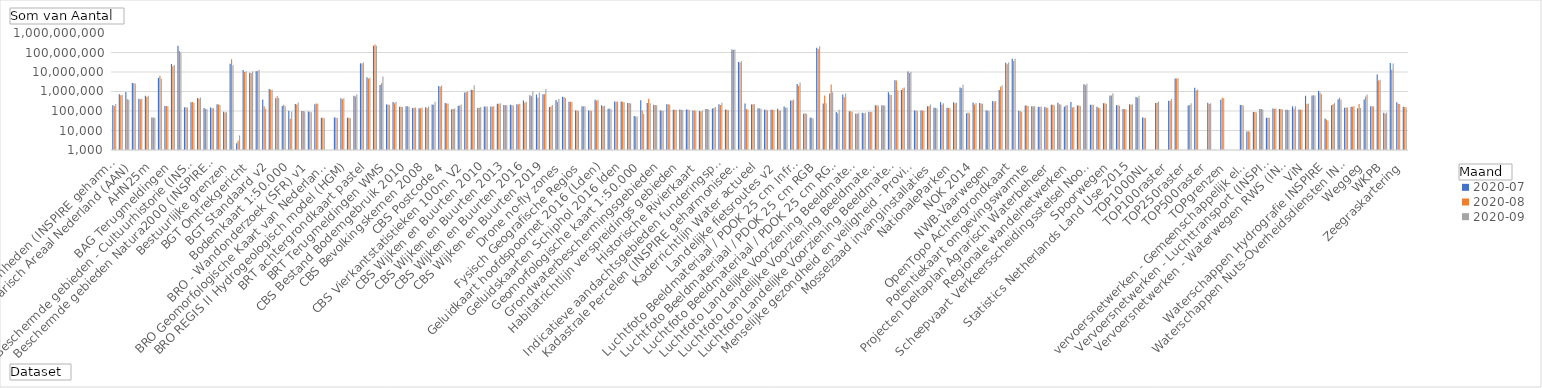
| Category | 2020-07 | 2020-08 | 2020-09 |
|---|---|---|---|
| Administratieve Eenheden (INSPIRE geharmoniseerd) | 198083 | 181839 | 227996 |
| Adressen (INSPIRE as-is) | 727634 | 640294 | 660280 |
| Adressen (INSPIRE geharmoniseerd) | 952412 | 399175 | 373213 |
| Agrarisch Areaal Nederland (AAN) | 2694952 | 2650679 | 2541201 |
| AHN1 | 427110 | 405824 | 427097 |
| AHN2 | 608271 | 515250 | 600037 |
| AHN25m | 46281 | 46161 | 44662 |
| AHN3 | 4969335 | 6356489 | 4466156 |
| Asbest scholenkaart | 182041 | 179001 | 176460 |
| BAG Terugmeldingen | 25712626 | 19608143 | 22717865 |
| BAGv1.1 | 220099471 | 119269418 | 99278156 |
| Beschermde gebieden - CDDA (INSPIRE geharmoniseerd) | 154346 | 153505 | 153034 |
| Beschermde gebieden - Cultuurhistorie (INSPIRE geharmoniseerd) | 285003 | 293150 | 258478 |
| Beschermde gebieden - Provincies (INSPIRE geharmoniseerd) | 460841 | 430606 | 494414 |
| Beschermde gebieden Nationale Parken (INSPIRE Geharmoniseerd) | 142062 | 125950 | 124117 |
| Beschermde gebieden Natura2000 (INSPIRE Geharmoniseerd) | 151690 | 139290 | 140931 |
| Beschermde gebieden Wetlands (INSPIRE Geharmoniseerd) | 220169 | 214620 | 202304 |
| Beschermde natuurmonumenten | 91910 | 82686 | 87700 |
| Bestuurlijke grenzen | 26513258 | 45641611 | 22099939 |
| BGT (extract) | 2235 | 2944 | 5630 |
| BGT Achtergrond | 12486517 | 10079108 | 10850455 |
| BGT Omtrekgericht | 9097327 | 8711046 | 10454254 |
| BGT Pastel | 11060649 | 11142897 | 13184371 |
| BGT Plantopografie | 393129 | 174023 | 128789 |
| BGT Standaard v2 | 1341460 | 1222701 | 1228446 |
| BGT Symbolen v2 | 449772 | 568701 | 460321 |
| BGT Terugmeldingen | 182857 | 206742 | 173373 |
| Bodemkaart 1:50.000 | 101634 | 39844 | 95455 |
| BRO - Bodemkaart (SGM) | 230235 | 213284 | 272368 |
| BRO - Geotechnische Boormonsteranalyse (BHR-GT) v1 | 101219 | 100750 | 95522 |
| BRO - Wandonderzoek (SFR) v1 | 93912 | 91553 | 87063 |
| BRO Bodemkundige boormonsterbeschrijvingen (BHR-P) | 223144 | 241202 | 233184 |
| BRO Digitaal Geologisch Model (DGM) | 45418 | 45023 | 42124 |
| BRO Geomorfologische Kaart van Nederland 2019 V1 | 504 | 310 | 289 |
| BRO GeoTop Model Download (GTM) | 46229 | 45909 | 43354 |
| BRO Grondwatermonitoringput (GMW) | 450266 | 405292 | 454898 |
| BRO REGIS II Hydrogeologisch model (HGM) | 45547 | 45165 | 42754 |
| BRP Gewaspercelen | 602204 | 560043 | 723895 |
| BRT achtergrondkaart grijs | 27869247 | 27366783 | 30605163 |
| BRT achtergrondkaart pastel | 5326489 | 4592663 | 5052995 |
| BRT achtergrondkaart standaard | 222780493 | 253519068 | 219264370 |
| BRT achtergrondkaart water | 2176400 | 2638424 | 5896331 |
| BRT Terugmeldingen WMS | 217091 | 216358 | 204576 |
| CBS Aardgas- en elektriciteitslevering | 289650 | 250693 | 297220 |
| CBS Bestand Bodemgebruik 2008 | 165799 | 165793 | 160434 |
| CBS Bestand Bodemgebruik 2010 | 175637 | 175143 | 165613 |
| CBS Bestand Bodemgebruik 2012 | 142665 | 144790 | 150993 |
| CBS Bestand Bodemgebruik 2015 | 137751 | 136959 | 150455 |
| CBS Bevolkingskernen 2008 | 153808 | 141029 | 172574 |
| CBS Bevolkingskernen 2011 | 215350 | 210030 | 296587 |
| CBS Gebiedsindeling | 1905089 | 1747315 | 2031949 |
| CBS Postcode 4 | 256726 | 241702 | 241882 |
| CBS Postcode 6 | 121821 | 127715 | 132833 |
| CBS Provincies | 185953 | 191575 | 214686 |
| CBS Vierkantstatistieken 100m V2 | 891262 | 918370 | 1043569 |
| CBS Vierkantstatistieken 500m V2 | 1213867 | 1186267 | 2115091 |
| CBS Wijken en Buurten 2009 | 141377 | 146217 | 162602 |
| CBS Wijken en Buurten 2010 | 167946 | 168622 | 172025 |
| CBS Wijken en Buurten 2011 | 172474 | 164641 | 172887 |
| CBS Wijken en Buurten 2012 | 237256 | 235399 | 250099 |
| CBS Wijken en Buurten 2013 | 200670 | 201009 | 196184 |
| CBS Wijken en Buurten 2014 | 208815 | 199538 | 195253 |
| CBS Wijken en Buurten 2015 | 223567 | 219336 | 238838 |
| CBS Wijken en Buurten 2016 | 341589 | 266967 | 298457 |
| CBS Wijken en Buurten 2017 | 634006 | 562816 | 1028152 |
| CBS Wijken en Buurten 2018 | 700132 | 479978 | 900563 |
| CBS Wijken en Buurten 2019 | 721366 | 730059 | 1337027 |
| Cultuurhistorisch GIS | 159802 | 170955 | 203484 |
| Digitaal Topografisch Bestand (DTB) | 368066 | 294604 | 417651 |
| Drone no-fly zones | 539781 | 516132 | 468087 |
| Ecotopen | 300559 | 298862 | 285819 |
| Faciliteiten voor productie en industrie - Provincies (INSPIRE geharmoniseerd) | 106557 | 106480 | 99025 |
| Fysisch Geografische Regios | 172781 | 171993 | 173433 |
| Gebieden met natuurrisico's - Provincies (INSPIRE geharmoniseerd) | 106657 | 107152 | 99256 |
| Gebouwen (INSPIRE geharmoniseerd) | 375243 | 338963 | 378464 |
| Geluidkaart hoofdspoornet 2016 (Lden) | 194345 | 175142 | 185663 |
| Geluidkaart hoofdspoornet 2016 (Lnight) | 131096 | 132899 | 124774 |
| Geluidskaarten Rijkswegen | 308175 | 297118 | 309008 |
| Geluidskaarten Schiphol 2016 lden | 304389 | 301079 | 282426 |
| Geluidskaarten Schiphol 2016 lnight | 255499 | 255745 | 240238 |
| Geografische Namen (INSPIRE geharmoniseerd) | 55824 | 52102 | 51728 |
| Geomorfologische kaart 1:50.000 | 352592 | 105010 | 69301 |
| Geotechnisch sondeeronderzoek (CPT) | 253610 | 428448 | 251859 |
| Gesloten Gebieden voor Visserij | 208635 | 205194 | 195811 |
| Grondwaterbeschermingsgebieden | 107084 | 107544 | 100255 |
| Habitatrichtlijn verspreiding van habitattypen | 224400 | 221629 | 210358 |
| Habitatrichtlijn verspreiding van typen | 117040 | 116781 | 111820 |
| Habitatrichtlijn verspreidings gebieden | 119459 | 117273 | 112007 |
| Habitatrichtlijn Vogelrichtlijn verspreiding van soorten | 119535 | 118499 | 111787 |
| Habitats en biotopen - Provincies (INSPIRE geharmoniseerd) | 106684 | 106500 | 99069 |
| Historische Rivierkaart | 99172 | 94048 | 106366 |
| Hydrografie - Netwerk RWS (INSPIRE geharmoniseerd) | 127885 | 126764 | 119493 |
| Hydrografie - Physical Waters (INSPIRE geharmoniseerd) | 133481 | 140954 | 158496 |
| Indicatieve aandachtsgebieden funderingsproblematiek | 224778 | 204883 | 261157 |
| Invasieve exoten (INSPIRE geharmoniseerd) | 118810 | 115917 | 110683 |
| Kadastrale kaart v4 | 143173990 | 134976178 | 143609489 |
| Kadastrale Percelen (INSPIRE geharmoniseerd) | 32611634 | 30327999 | 35767394 |
| Kaderrichtlijn marienestrategie 2018 | 241827 | 125307 | 119792 |
| Kaderrichtlijn stedelijkafvalwater 2015 | 217348 | 219831 | 222345 |
| Kaderrichtlijn Water actueel | 137144 | 136388 | 131315 |
| Kaderrichtlijn Water EU2009 | 115773 | 116026 | 108458 |
| Kaderrichtlijn Water EU2015 | 116833 | 116350 | 109085 |
| Landelijke fietsroutes v2 | 130707 | 106192 | 109296 |
| Landelijke wandelroutes | 169437 | 148419 | 149771 |
| Liander Elektriciteitsnetten | 340720 | 342333 | 382222 |
| Luchtfoto Beeldmateriaal / PDOK 25 cm Infrarood | 2389973 | 1956871 | 2935293 |
| Luchtfoto Beeldmateriaal / PDOK 25 cm Infrarood 2016 | 71610 | 76004 | 70166 |
| Luchtfoto Beeldmateriaal / PDOK 25 cm Infrarood 2017 | 44502 | 44549 | 41304 |
| Luchtfoto Beeldmateriaal / PDOK 25 cm RGB | 176488337 | 151147734 | 209198613 |
| Luchtfoto Beeldmateriaal / PDOK 25 cm RGB 2016 | 239707 | 619782 | 253261 |
| Luchtfoto Beeldmateriaal / PDOK 25 cm RGB 2017 | 796543 | 2289781 | 918985 |
| Luchtfoto Beeldmateriaal / PDOK 25 cm RGB 2018 | 88798 | 77432 | 114748 |
| Luchtfoto Beeldmateriaal / PDOK 25 cm RGB 2019 | 702343 | 509508 | 779961 |
| Luchtfoto Landelijke Voorziening Beeldmateriaal 2012 Gesloten | 96660 | 96321 | 92151 |
| Luchtfoto Landelijke Voorziening Beeldmateriaal 2013 Gesloten | 75477 | 71543 | 80503 |
| Luchtfoto Landelijke Voorziening Beeldmateriaal 2014 Gesloten | 80404 | 76130 | 80141 |
| Luchtfoto Landelijke Voorziening Beeldmateriaal 2015 Gesloten | 90965 | 88915 | 92086 |
| Luchtfoto Landelijke Voorziening Beeldmateriaal 2016 Gesloten | 196898 | 190864 | 193626 |
| Luchtfoto Landelijke Voorziening Beeldmateriaal 2017 Gesloten | 198024 | 189003 | 192442 |
| Luchtfoto Landelijke Voorziening Beeldmateriaal 2018 Gesloten | 904830 | 695186 | 669074 |
| Luchtfoto Landelijke Voorziening Beeldmateriaal 2019 Gesloten | 3816390 | 3627270 | 1164322 |
| Luchtfoto Landelijke Voorziening Beeldmateriaal 2020 Gesloten | 1202024 | 1463193 | 1587611 |
| Luchtfotolabels | 10700476 | 8964327 | 10444683 |
| Menselijke gezondheid en veiligheid - Provincies (INSPIRE geharmoniseerd) | 106572 | 106682 | 100035 |
| Milieubewakingsvoorzieningen - Provincies (INSPIRE geharmoniseerd) | 106525 | 106517 | 99035 |
| Mossel- en oesterhabitats | 175557 | 177250 | 213604 |
| Mosselzaad invanginstallaties | 145544 | 144294 | 136643 |
| NAPinfo | 285416 | 210709 | 249657 |
| Nationale EnergieAtlas | 147014 | 142404 | 137031 |
| NationaleParken | 278504 | 251880 | 269157 |
| Natura 2000 | 1602788 | 1493728 | 2214356 |
| NHI | 76280 | 83083 | 74666 |
| NOK 2014 | 269282 | 214335 | 257298 |
| Noordzee Vaarwegmarkeringen | 254562 | 239548 | 237021 |
| Nutsdiensten en overheidsdiensten - Provincies (INSPIRE geharmoniseerd) | 106541 | 106535 | 99134 |
| NWB-Vaarwegen | 321756 | 296595 | 321553 |
| NWB-Wegen | 1208862 | 1755883 | 2089096 |
| OpenTopo | 29428858 | 25198299 | 31676775 |
| OpenTopo Achtergrondkaart | 47386598 | 36222000 | 47598070 |
| Overheidsdiensten | 103181 | 97111 | 91790 |
| Potentieel koude en warmte uit open en gesloten WKO systemen | 192637 | 191559 | 180159 |
| Potentiekaart omgevingswarmte | 175968 | 171012 | 177260 |
| Potentiekaart reststromen | 167272 | 161689 | 169143 |
| Potentiekaart restwarmte | 158546 | 151731 | 146313 |
| Projecten Deltaplan Agrarisch Waterbeheer | 209435 | 206508 | 196084 |
| RDinfo | 266058 | 224830 | 217226 |
| Regionale fietsnetwerken | 163298 | 189223 | 196649 |
| Regionale wandelnetwerken | 285605 | 149807 | 160581 |
| Richtlijn Overstromingsrisico EU2018 | 190709 | 190271 | 177923 |
| Ruimtelijke plannen | 2331441 | 2087543 | 2508786 |
| Scheepvaart Verkeersscheidingsstelsel Noordzee | 207891 | 208986 | 211231 |
| Schelpdierenpercelen | 166984 | 147593 | 136554 |
| Schelpdierwater | 250307 | 249367 | 233533 |
| Spoorwegen | 621967 | 620232 | 804891 |
| Statistical Units (SU-Vector) | 197927 | 196331 | 185111 |
| Statistical Units Grid | 125789 | 125846 | 118287 |
| Statistics Netherlands Land Use 2015 | 219080 | 215709 | 216202 |
| Stedelijk Water (Riolering) v1 | 524340 | 475852 | 600506 |
| SVIR (Structuurvisie Infrastructuur en Ruimte) | 45844 | 45490 | 42761 |
| TOP1000NL | 316 | 251 | 162 |
| TOP1000raster | 260885 | 261717 | 303776 |
| TOP100NL | 981 | 796 | 853 |
| TOP100raster | 335066 | 339151 | 421618 |
| TOP10NLV2 | 4637184 | 4601828 | 4790191 |
| TOP250NL | 864 | 593 | 639 |
| TOP250raster | 193193 | 200352 | 253351 |
| TOP25raster | 1541298 | 1132219 | 1249753 |
| TOP500NL | 390 | 374 | 343 |
| TOP500raster | 267171 | 231913 | 247221 |
| TOP50NL | 1028 | 812 | 835 |
| TOP50raster | 380064 | 484560 | 451626 |
| TOPgrenzen | 215 | 181 | 117 |
| TOPnamen | 245 | 170 | 110 |
| Verkeersongevallen - Nederland 2008 - 2017 | 204269 | 204410 | 193696 |
| vervoersnetwerken - Gemeenschappelijk elementen (INSPIRE geharmoniseerd) | 9014 | 9098 | 8610 |
| Vervoersnetwerken - Gemeenschappelijke elementen (INSPIRE geharmoniseerd) | 89744 | 88836 | 83932 |
| Vervoersnetwerken - Kabelbanen (INSPIRE geharmoniseerd) | 126034 | 125081 | 117873 |
| Vervoersnetwerken - Luchttransport (INSPIRE geharmoniseerd) | 44892 | 44649 | 45674 |
| Vervoersnetwerken - Spoorwegen (INSPIRE geharmoniseerd) | 133093 | 130650 | 133924 |
| Vervoersnetwerken - Waterwegen (INSPIRE geharmoniseerd) | 126495 | 127251 | 118471 |
| Vervoersnetwerken - Waterwegen RWS (INSPIRE geharmoniseerd) | 117466 | 116841 | 111400 |
| Vervoersnetwerken - Wegen (INSPIRE geharmoniseerd) | 173767 | 129248 | 177327 |
| Vervoersnetwerken Wegen RWS (INSPIRE geharmoniseerd) | 118852 | 117169 | 114617 |
| ViN | 604394 | 231624 | 240670 |
| Vogelrichtlijn verspreidingsgebied van soorten | 623176 | 643972 | 614761 |
| Waterschappen Administratieve eenheden INSPIRE | 1080565 | 884131 | 718827 |
| Waterschappen Hydrografie INSPIRE | 41248 | 36238 | 31760 |
| Waterschappen Keringen IMWA | 198369 | 223438 | 254191 |
| Waterschappen Kunstwerken IMWA | 398302 | 478976 | 377276 |
| Waterschappen Nuts-Overheidsdiensten INSPIRE | 146969 | 150456 | 151447 |
| Waterschappen Oppervlaktewateren IMWA | 165918 | 165144 | 178626 |
| Waterschappen Waterbeheergebieden IMWA | 137645 | 229059 | 141773 |
| Weggeg | 392182 | 549335 | 696106 |
| Wetlands | 176603 | 173227 | 171155 |
| Windsnelheden 100m hoogte | 7530845 | 3709601 | 4007841 |
| WKPB | 81231 | 72676 | 83470 |
| WOZ loket | 29164099 | 13216219 | 27485078 |
| Zeegebieden (INSPIRE geharmoniseerd) | 280000 | 232538 | 231907 |
| Zeegraskartering | 163147 | 162296 | 152618 |